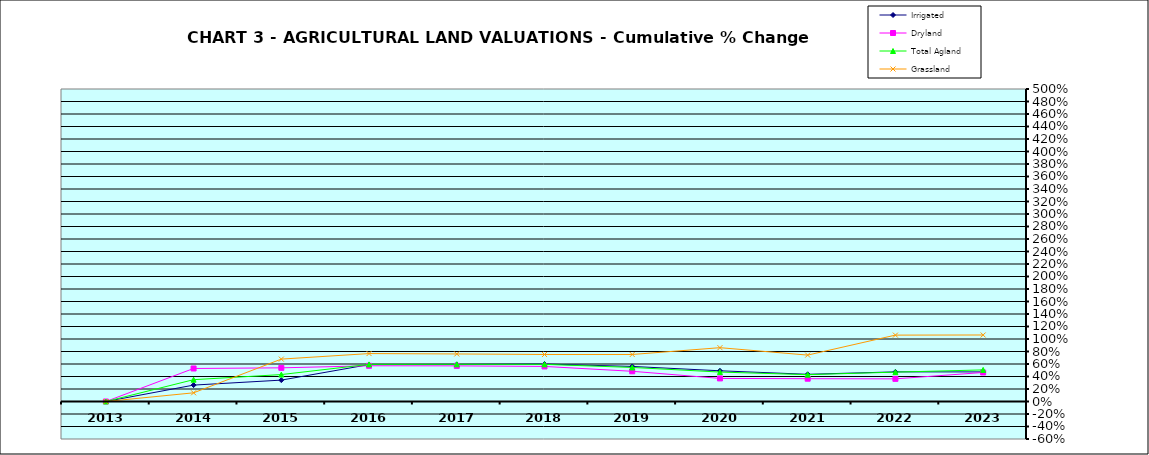
| Category | Irrigated | Dryland | Total Agland | Grassland |
|---|---|---|---|---|
| 2013.0 | 0 | 0 | 0 | 0 |
| 2014.0 | 0.262 | 0.528 | 0.349 | 0.139 |
| 2015.0 | 0.342 | 0.539 | 0.431 | 0.678 |
| 2016.0 | 0.591 | 0.572 | 0.594 | 0.767 |
| 2017.0 | 0.593 | 0.57 | 0.595 | 0.761 |
| 2018.0 | 0.599 | 0.561 | 0.594 | 0.752 |
| 2019.0 | 0.561 | 0.483 | 0.545 | 0.752 |
| 2020.0 | 0.491 | 0.369 | 0.471 | 0.861 |
| 2021.0 | 0.435 | 0.365 | 0.429 | 0.742 |
| 2022.0 | 0.474 | 0.362 | 0.47 | 1.062 |
| 2023.0 | 0.473 | 0.464 | 0.506 | 1.064 |